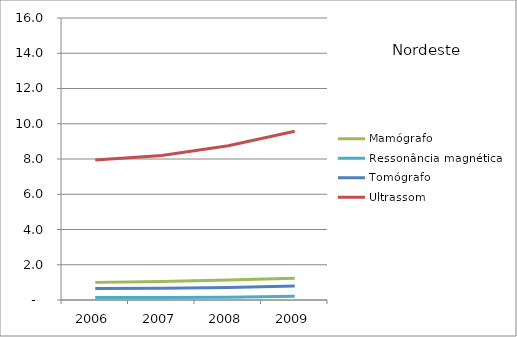
| Category | Mamógrafo | Ressonância magnética | Tomógrafo | Ultrassom |
|---|---|---|---|---|
| 2006.0 | 1 | 0.14 | 0.65 | 7.95 |
| 2007.0 | 1.05 | 0.14 | 0.66 | 8.2 |
| 2008.0 | 1.13 | 0.15 | 0.71 | 8.75 |
| 2009.0 | 1.24 | 0.21 | 0.79 | 9.57 |